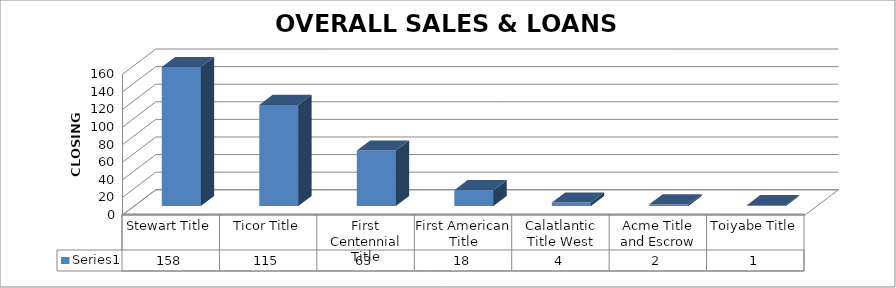
| Category | Series 0 |
|---|---|
| Stewart Title | 158 |
| Ticor Title | 115 |
| First Centennial Title | 63 |
| First American Title | 18 |
| Calatlantic Title West | 4 |
| Acme Title and Escrow | 2 |
| Toiyabe Title | 1 |